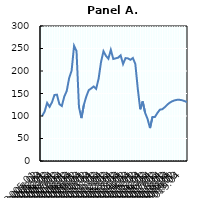
| Category | Oil  |
|---|---|
| 2005:01 | 100 |
| 2005:02 | 110.279 |
| 2005:03 | 129.087 |
| 2005:04 | 120.434 |
| 2006:01 | 130.755 |
| 2006:02 | 146.706 |
| 2006:03 | 147.415 |
| 2006:04 | 126.376 |
| 2007:01 | 122.227 |
| 2007:02 | 143.161 |
| 2007:03 | 155.442 |
| 2007:04 | 184.591 |
| 2008:01 | 200.813 |
| 2008:02 | 256.026 |
| 2008:03 | 244.266 |
| 2008:04 | 119.871 |
| 2009:01 | 95.329 |
| 2009:02 | 124.896 |
| 2009:03 | 143.599 |
| 2009:04 | 157.506 |
| 2010:01 | 161.322 |
| 2010:02 | 165.575 |
| 2010:03 | 160.467 |
| 2010:04 | 182.339 |
| 2011:01 | 220.017 |
| 2011:02 | 243.932 |
| 2011:03 | 233.716 |
| 2011:04 | 227.314 |
| 2012:01 | 246.977 |
| 2012:02 | 226.772 |
| 2012:03 | 228.148 |
| 2012:04 | 229.629 |
| 2013:01 | 234.862 |
| 2013:02 | 215.492 |
| 2013:03 | 228.628 |
| 2013:04 | 228.003 |
| 2014:01 | 224.917 |
| 2014:02 | 228.857 |
| 2014:03 | 215.721 |
| 2014:04 | 160.696 |
| 2015:01 | 114.95 |
| 2015:02 | 132.402 |
| 2015:03 | 106.964 |
| 2015:04 | 93.223 |
| 2016:01 | 73.146 |
| 2016:02 | 97.938 |
| 2016:03 | 97.953 |
| 2016:04 | 106.604 |
| 2017:01 | 114.015 |
| 2017:02 | 115.025 |
| 2017:03 | 119.448 |
| 2017:04 | 124.987 |
| 2018:01 | 129.388 |
| 2018:02 | 132.584 |
| 2018:03 | 134.708 |
| 2018:04 | 135.914 |
| 2019:01 | 136 |
| 2019:02 | 135.13 |
| 2019:03 | 133.353 |
| 2019:04 | 130.867 |